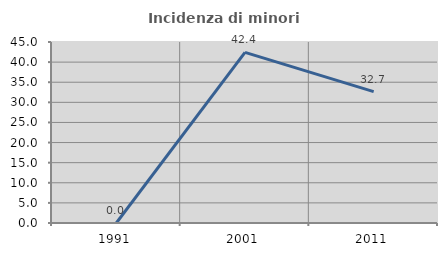
| Category | Incidenza di minori stranieri |
|---|---|
| 1991.0 | 0 |
| 2001.0 | 42.424 |
| 2011.0 | 32.673 |